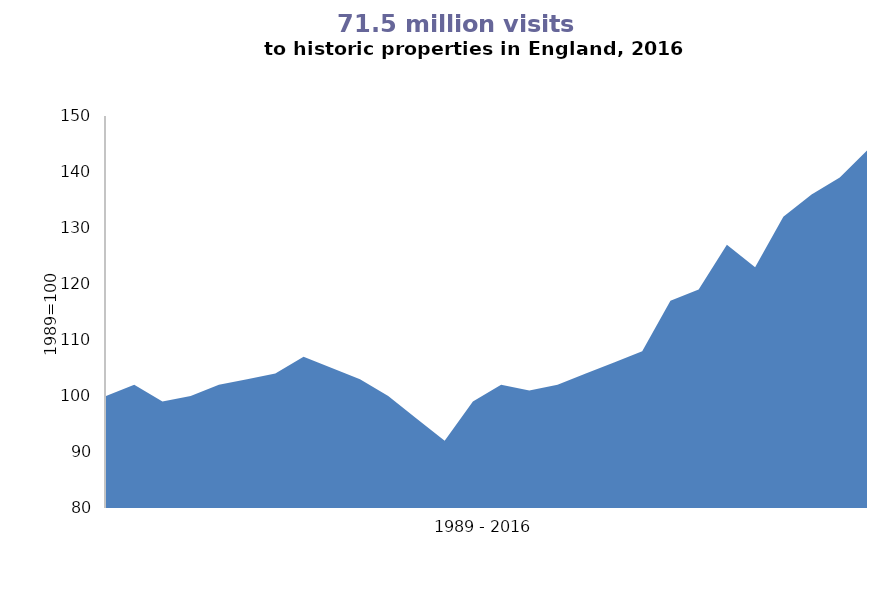
| Category | Series 0 |
|---|---|
| 0 | 100 |
| 1 | 102 |
| 2 | 99 |
| 3 | 100 |
| 4 | 102 |
| 5 | 103 |
| 6 | 104 |
| 7 | 107 |
| 8 | 105 |
| 9 | 103 |
| 10 | 100 |
| 11 | 96 |
| 12 | 92 |
| 13 | 99 |
| 14 | 102 |
| 15 | 101 |
| 16 | 102 |
| 17 | 104 |
| 18 | 106 |
| 19 | 108 |
| 20 | 117 |
| 21 | 119 |
| 22 | 127 |
| 23 | 123 |
| 24 | 132 |
| 25 | 136 |
| 26 | 139 |
| 27 | 144 |